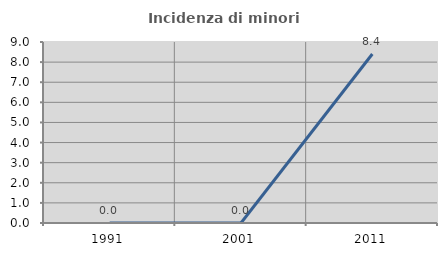
| Category | Incidenza di minori stranieri |
|---|---|
| 1991.0 | 0 |
| 2001.0 | 0 |
| 2011.0 | 8.403 |